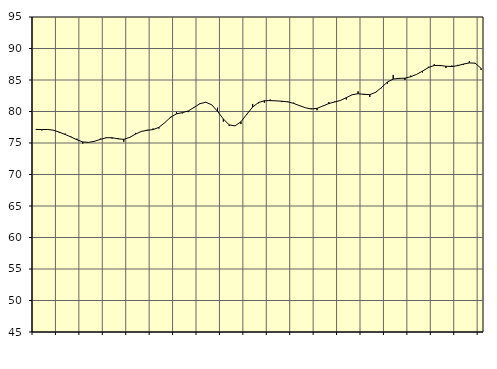
| Category | Piggar | Samtliga sysselsatta (inkl. sysselsatta utomlands) |
|---|---|---|
| nan | 77.2 | 77.16 |
| 1.0 | 77 | 77.13 |
| 1.0 | 77.2 | 77.15 |
| 1.0 | 77 | 77.03 |
| nan | 76.6 | 76.72 |
| 2.0 | 76.5 | 76.35 |
| 2.0 | 76 | 75.95 |
| 2.0 | 75.7 | 75.51 |
| nan | 74.9 | 75.17 |
| 3.0 | 75.1 | 75.1 |
| 3.0 | 75.3 | 75.27 |
| 3.0 | 75.7 | 75.58 |
| nan | 75.9 | 75.83 |
| 4.0 | 75.7 | 75.84 |
| 4.0 | 75.8 | 75.66 |
| 4.0 | 75.2 | 75.58 |
| nan | 75.8 | 75.89 |
| 5.0 | 76.6 | 76.41 |
| 5.0 | 76.8 | 76.84 |
| 5.0 | 77.1 | 77.02 |
| nan | 77.3 | 77.13 |
| 6.0 | 77.3 | 77.48 |
| 6.0 | 78.2 | 78.23 |
| 6.0 | 79 | 79.1 |
| nan | 79.9 | 79.63 |
| 7.0 | 79.7 | 79.82 |
| 7.0 | 79.9 | 80.08 |
| 7.0 | 80.7 | 80.65 |
| nan | 81.3 | 81.24 |
| 8.0 | 81.5 | 81.47 |
| 8.0 | 81.1 | 81.07 |
| 8.0 | 80.6 | 80.04 |
| nan | 78.4 | 78.81 |
| 9.0 | 77.7 | 77.87 |
| 9.0 | 77.7 | 77.72 |
| 9.0 | 78 | 78.37 |
| nan | 79.5 | 79.56 |
| 10.0 | 81.2 | 80.71 |
| 10.0 | 81.3 | 81.43 |
| 10.0 | 81.4 | 81.71 |
| nan | 81.9 | 81.73 |
| 11.0 | 81.7 | 81.69 |
| 11.0 | 81.5 | 81.63 |
| 11.0 | 81.6 | 81.53 |
| nan | 81.4 | 81.29 |
| 12.0 | 81 | 80.93 |
| 12.0 | 80.6 | 80.6 |
| 12.0 | 80.5 | 80.4 |
| nan | 80.2 | 80.5 |
| 13.0 | 80.9 | 80.88 |
| 13.0 | 81.5 | 81.26 |
| 13.0 | 81.6 | 81.51 |
| nan | 81.8 | 81.76 |
| 14.0 | 81.9 | 82.2 |
| 14.0 | 82.7 | 82.66 |
| 14.0 | 83.2 | 82.82 |
| nan | 82.8 | 82.72 |
| 15.0 | 82.3 | 82.68 |
| 15.0 | 83.1 | 83.04 |
| 15.0 | 83.7 | 83.81 |
| nan | 84.4 | 84.67 |
| 16.0 | 85.8 | 85.15 |
| 16.0 | 85.2 | 85.26 |
| 16.0 | 85 | 85.29 |
| nan | 85.7 | 85.52 |
| 17.0 | 85.9 | 85.9 |
| 17.0 | 86.2 | 86.41 |
| 17.0 | 87.1 | 86.97 |
| nan | 87.5 | 87.31 |
| 18.0 | 87.2 | 87.31 |
| 18.0 | 86.9 | 87.18 |
| 18.0 | 87.3 | 87.14 |
| nan | 87.4 | 87.28 |
| 19.0 | 87.4 | 87.53 |
| 19.0 | 88 | 87.71 |
| 19.0 | 87.6 | 87.67 |
| nan | 86.6 | 86.85 |